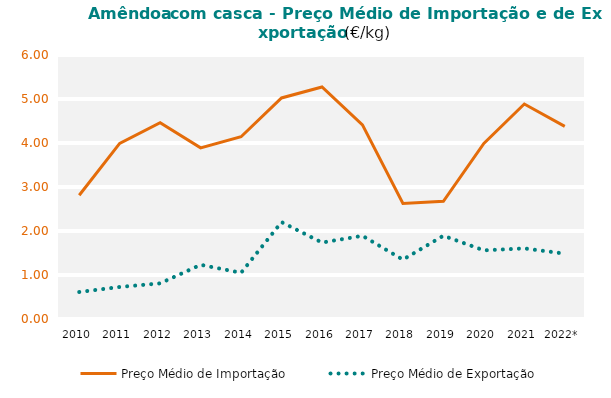
| Category | Preço Médio de Importação | Preço Médio de Exportação |
|---|---|---|
| 2010 | 2.812 | 0.613 |
| 2011 | 3.99 | 0.728 |
| 2012 | 4.462 | 0.81 |
| 2013 | 3.889 | 1.231 |
| 2014 | 4.143 | 1.051 |
| 2015 | 5.024 | 2.202 |
| 2016 | 5.273 | 1.737 |
| 2017 | 4.411 | 1.891 |
| 2018 | 2.627 | 1.349 |
| 2019 | 2.675 | 1.893 |
| 2020 | 3.989 | 1.56 |
| 2021 | 4.886 | 1.605 |
| 2022* | 4.379 | 1.485 |